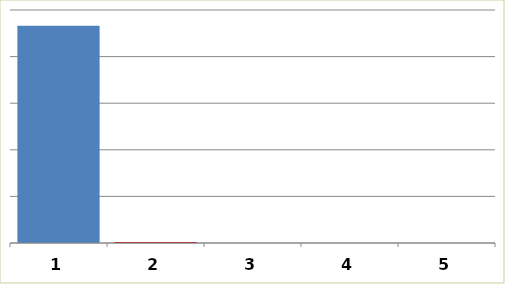
| Category | Series 0 |
|---|---|
| 0 | 2331523.52 |
| 1 | 12000 |
| 2 | 0 |
| 3 | 0 |
| 4 | 0 |